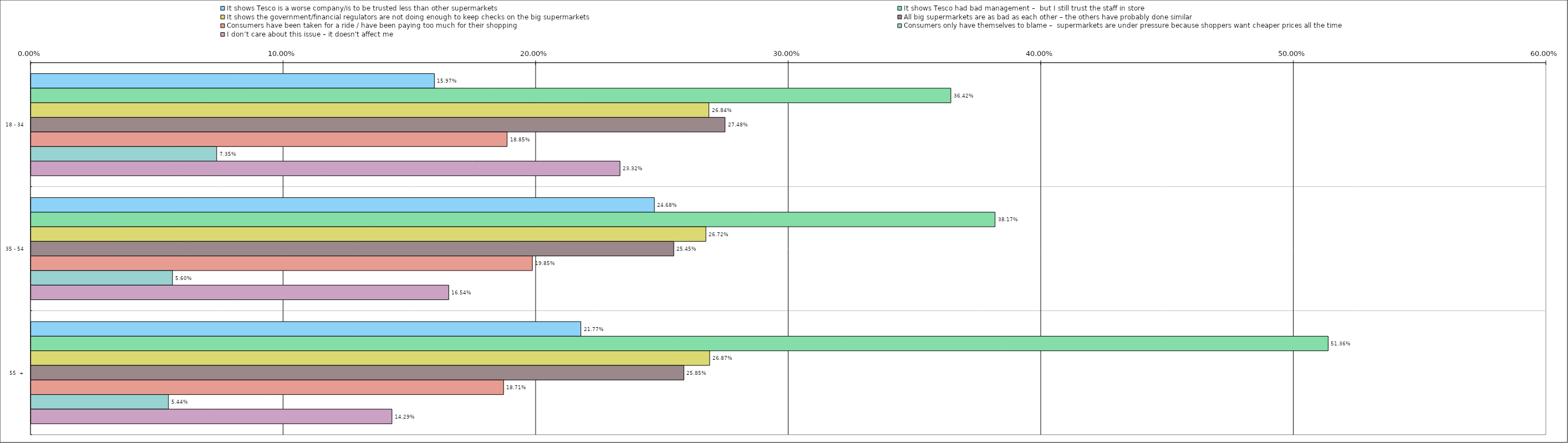
| Category | It shows Tesco is a worse company/is to be trusted less than other supermarkets | It shows Tesco had bad management –  but I still trust the staff in store | It shows the government/financial regulators are not doing enough to keep checks on the big supermarkets | All big supermarkets are as bad as each other – the others have probably done similar | Consumers have been taken for a ride / have been paying too much for their shopping | Consumers only have themselves to blame –  supermarkets are under pressure because shoppers want cheaper prices all the time | I don’t care about this issue – it doesn't affect me |
|---|---|---|---|---|---|---|---|
| 0 | 0.16 | 0.364 | 0.268 | 0.275 | 0.188 | 0.074 | 0.233 |
| 1 | 0.247 | 0.382 | 0.267 | 0.254 | 0.198 | 0.056 | 0.165 |
| 2 | 0.218 | 0.514 | 0.269 | 0.258 | 0.187 | 0.054 | 0.143 |